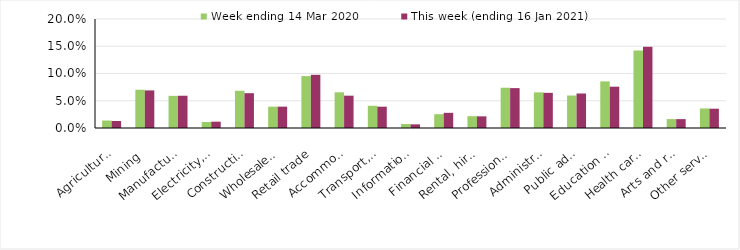
| Category | Week ending 14 Mar 2020 | This week (ending 16 Jan 2021) |
|---|---|---|
| Agriculture, forestry and fishing | 0.014 | 0.013 |
| Mining | 0.07 | 0.069 |
| Manufacturing | 0.059 | 0.059 |
| Electricity, gas, water and waste services | 0.011 | 0.012 |
| Construction | 0.068 | 0.064 |
| Wholesale trade | 0.039 | 0.039 |
| Retail trade | 0.095 | 0.098 |
| Accommodation and food services | 0.066 | 0.059 |
| Transport, postal and warehousing | 0.041 | 0.039 |
| Information media and telecommunications | 0.007 | 0.007 |
| Financial and insurance services | 0.025 | 0.028 |
| Rental, hiring and real estate services | 0.022 | 0.021 |
| Professional, scientific and technical services | 0.074 | 0.073 |
| Administrative and support services | 0.065 | 0.064 |
| Public administration and safety | 0.06 | 0.063 |
| Education and training | 0.086 | 0.076 |
| Health care and social assistance | 0.142 | 0.149 |
| Arts and recreation services | 0.016 | 0.016 |
| Other services | 0.036 | 0.035 |